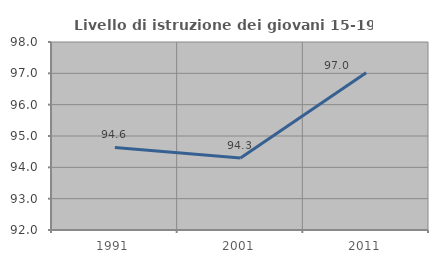
| Category | Livello di istruzione dei giovani 15-19 anni |
|---|---|
| 1991.0 | 94.636 |
| 2001.0 | 94.298 |
| 2011.0 | 97.021 |